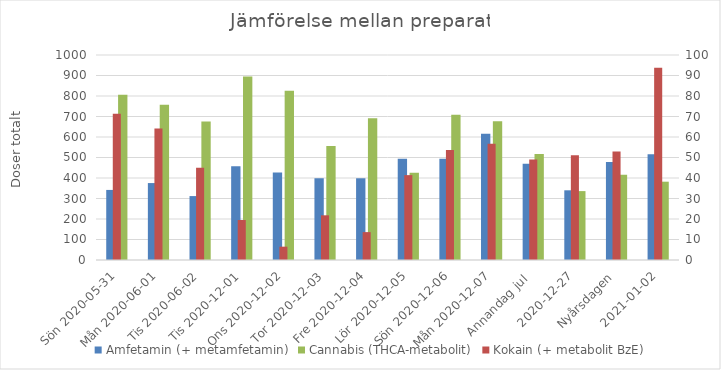
| Category | Amfetamin (+ metamfetamin) | Cannabis (THCA-metabolit) |
|---|---|---|
| Sön 2020-05-31 | 341.8 | 806.5 |
| Mån 2020-06-01 | 375.3 | 757.4 |
|  Tis 2020-06-02 | 311.8 | 676 |
| Tis 2020-12-01 | 456.9 | 895.7 |
| Ons 2020-12-02 | 427.1 | 826 |
| Tor 2020-12-03 | 398.8 | 555.6 |
| Fre 2020-12-04 | 398.7 | 690.9 |
| Lör 2020-12-05 | 493.5 | 425.4 |
| Sön 2020-12-06 | 493.6 | 708.1 |
| Mån 2020-12-07 | 615.4 | 677 |
| Annandag jul  | 469.1 | 517.1 |
| 2020-12-27 | 340 | 336.1 |
| Nyårsdagen | 478.3 | 416.1 |
| 2021-01-02 | 515.3 | 382 |